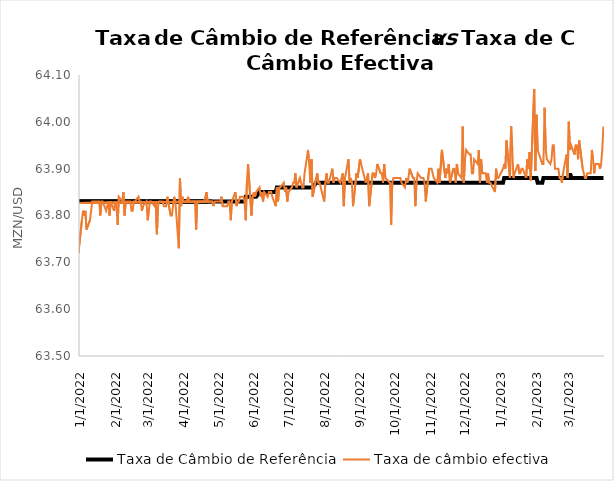
| Category | Taxa de Câmbio de Referência | Taxa de câmbio efectiva |
|---|---|---|
| 12/14/21 | 63.83 | 63.76 |
| 12/15/21 | 63.83 | 63.82 |
| 12/16/21 | 63.83 | 63.8 |
| 12/17/21 | 63.83 | 63.79 |
| 12/20/21 | 63.83 | 63.84 |
| 12/21/21 | 63.83 | 63.79 |
| 12/22/21 | 63.83 | 63.8 |
| 12/23/21 | 63.83 | 63.82 |
| 12/27/21 | 63.83 | 63.77 |
| 12/28/21 | 63.83 | 63.74 |
| 12/29/21 | 63.83 | 63.76 |
| 12/30/21 | 63.83 | 63.78 |
| 12/31/21 | 63.83 | 63.72 |
| 1/3/22 | 63.83 | 63.79 |
| 1/4/22 | 63.83 | 63.81 |
| 1/5/22 | 63.83 | 63.8 |
| 1/6/22 | 63.83 | 63.81 |
| 1/7/22 | 63.83 | 63.77 |
| 1/10/22 | 63.83 | 63.79 |
| 1/12/22 | 63.83 | 63.83 |
| 1/13/22 | 63.83 | 63.83 |
| 1/14/22 | 63.83 | 63.83 |
| 1/17/22 | 63.83 | 63.83 |
| 1/18/22 | 63.83 | 63.83 |
| 1/19/22 | 63.83 | 63.8 |
| 1/20/22 | 63.83 | 63.83 |
| 1/21/22 | 63.83 | 63.83 |
| 1/24/22 | 63.83 | 63.81 |
| 1/25/22 | 63.83 | 63.82 |
| 1/26/22 | 63.83 | 63.83 |
| 1/27/22 | 63.83 | 63.8 |
| 1/28/22 | 63.83 | 63.83 |
| 1/31/22 | 63.83 | 63.81 |
| 2/1/22 | 63.83 | 63.83 |
| 2/2/22 | 63.83 | 63.82 |
| 2/3/22 | 63.83 | 63.78 |
| 2/4/22 | 63.83 | 63.84 |
| 2/7/22 | 63.83 | 63.83 |
| 2/8/22 | 63.83 | 63.85 |
| 2/9/22 | 63.83 | 63.8 |
| 2/10/22 | 63.83 | 63.83 |
| 2/11/22 | 63.83 | 63.83 |
| 2/14/22 | 63.83 | 63.83 |
| 2/15/22 | 63.83 | 63.81 |
| 2/16/22 | 63.83 | 63.81 |
| 2/17/22 | 63.83 | 63.83 |
| 2/18/22 | 63.83 | 63.83 |
| 2/21/22 | 63.83 | 63.84 |
| 2/22/22 | 63.83 | 63.83 |
| 2/23/22 | 63.83 | 63.83 |
| 2/24/22 | 63.83 | 63.81 |
| 2/25/22 | 63.83 | 63.82 |
| 2/28/22 | 63.83 | 63.83 |
| 3/1/22 | 63.83 | 63.79 |
| 3/2/22 | 63.83 | 63.81 |
| 3/3/22 | 63.83 | 63.83 |
| 3/4/22 | 63.83 | 63.83 |
| 3/7/22 | 63.83 | 63.82 |
| 3/8/22 | 63.83 | 63.83 |
| 3/9/22 | 63.83 | 63.76 |
| 3/10/22 | 63.83 | 63.82 |
| 3/11/22 | 63.83 | 63.83 |
| 3/14/22 | 63.83 | 63.83 |
| 3/15/22 | 63.83 | 63.82 |
| 3/16/22 | 63.83 | 63.82 |
| 3/17/22 | 63.83 | 63.82 |
| 3/18/22 | 63.83 | 63.84 |
| 3/21/22 | 63.83 | 63.8 |
| 3/22/22 | 63.83 | 63.8 |
| 3/23/22 | 63.83 | 63.82 |
| 3/24/22 | 63.83 | 63.84 |
| 3/25/22 | 63.83 | 63.83 |
| 3/28/22 | 63.83 | 63.73 |
| 3/29/22 | 63.83 | 63.88 |
| 3/30/22 | 63.83 | 63.82 |
| 3/31/22 | 63.83 | 63.84 |
| 4/1/22 | 63.83 | 63.83 |
| 4/4/22 | 63.83 | 63.83 |
| 4/5/22 | 63.83 | 63.84 |
| 4/6/22 | 63.83 | 63.83 |
| 4/8/22 | 63.83 | 63.83 |
| 4/11/22 | 63.83 | 63.83 |
| 4/12/22 | 63.83 | 63.77 |
| 4/13/22 | 63.83 | 63.83 |
| 4/14/22 | 63.83 | 63.83 |
| 4/18/22 | 63.83 | 63.83 |
| 4/19/22 | 63.83 | 63.83 |
| 4/20/22 | 63.83 | 63.84 |
| 4/21/22 | 63.83 | 63.85 |
| 4/22/22 | 63.83 | 63.83 |
| 4/25/20 | 63.83 | 63.81 |
| 4/26/22 | 63.83 | 63.83 |
| 4/27/22 | 63.83 | 63.82 |
| 4/28/22 | 63.83 | 63.83 |
| 4/29/22 | 63.83 | 63.83 |
| 5/3/22 | 63.83 | 63.83 |
| 5/4/22 | 63.83 | 63.84 |
| 5/5/22 | 63.83 | 63.82 |
| 5/6/22 | 63.83 | 63.82 |
| 5/9/22 | 63.83 | 63.82 |
| 5/10/22 | 63.83 | 63.83 |
| 5/11/22 | 63.83 | 63.83 |
| 5/12/22 | 63.83 | 63.79 |
| 5/13/22 | 63.83 | 63.83 |
| 5/16/22 | 63.83 | 63.85 |
| 5/17/22 | 63.83 | 63.82 |
| 5/18/22 | 63.83 | 63.83 |
| 5/19/22 | 63.83 | 63.83 |
| 5/20/22 | 63.83 | 63.84 |
| 5/23/22 | 63.83 | 63.84 |
| 5/24/22 | 63.83 | 63.83 |
| 5/25/22 | 63.84 | 63.79 |
| 5/26/22 | 63.84 | 63.87 |
| 5/27/22 | 63.84 | 63.91 |
| 5/30/22 | 63.84 | 63.8 |
| 5/31/22 | 63.84 | 63.84 |
| 6/1/22 | 63.84 | 63.85 |
| 6/2/22 | 63.84 | 63.84 |
| 6/3/22 | 63.84 | 63.85 |
| 6/6/22 | 63.85 | 63.86 |
| 6/7/22 | 63.85 | 63.84 |
| 6/8/22 | 63.85 | 63.85 |
| 6/9/22 | 63.85 | 63.83 |
| 6/10/22 | 63.85 | 63.85 |
| 6/13/22 | 63.85 | 63.84 |
| 6/14/22 | 63.85 | 63.85 |
| 6/15/22 | 63.85 | 63.85 |
| 6/16/22 | 63.85 | 63.85 |
| 6/17/22 | 63.85 | 63.84 |
| 6/20/22 | 63.85 | 63.82 |
| 6/21/22 | 63.86 | 63.86 |
| 6/22/22 | 63.86 | 63.83 |
| 6/23/22 | 63.86 | 63.86 |
| 6/24/22 | 63.86 | 63.86 |
| 6/27/22 | 63.86 | 63.87 |
| 6/28/22 | 63.86 | 63.85 |
| 6/29/22 | 63.86 | 63.86 |
| 6/30/22 | 63.86 | 63.83 |
| 7/1/22 | 63.86 | 63.85 |
| 7/4/22 | 63.86 | 63.86 |
| 7/5/22 | 63.86 | 63.87 |
| 7/6/22 | 63.86 | 63.87 |
| 7/7/22 | 63.86 | 63.89 |
| 7/8/22 | 63.86 | 63.86 |
| 7/11/22 | 63.86 | 63.88 |
| 7/12/22 | 63.86 | 63.87 |
| 7/13/22 | 63.86 | 63.86 |
| 7/14/22 | 63.86 | 63.86 |
| 7/15/22 | 63.86 | 63.89 |
| 7/18/22 | 63.86 | 63.94 |
| 7/19/22 | 63.86 | 63.91 |
| 7/20/22 | 63.86 | 63.87 |
| 7/21/22 | 63.86 | 63.92 |
| 7/22/22 | 63.86 | 63.84 |
| 7/25/22 | 63.87 | 63.88 |
| 7/26/22 | 63.87 | 63.89 |
| 7/27/22 | 63.87 | 63.87 |
| 7/28/22 | 63.87 | 63.87 |
| 7/29/22 | 63.87 | 63.86 |
| 8/1/22 | 63.87 | 63.83 |
| 8/2/22 | 63.87 | 63.87 |
| 8/3/22 | 63.87 | 63.89 |
| 8/4/22 | 63.87 | 63.87 |
| 8/5/22 | 63.87 | 63.87 |
| 8/8/22 | 63.87 | 63.9 |
| 8/9/22 | 63.87 | 63.87 |
| 8/10/22 | 63.87 | 63.88 |
| 8/11/22 | 63.87 | 63.88 |
| 8/12/22 | 63.87 | 63.88 |
| 8/15/22 | 63.87 | 63.87 |
| 8/16/22 | 63.87 | 63.88 |
| 8/17/22 | 63.87 | 63.89 |
| 8/18/22 | 63.87 | 63.82 |
| 8/19/22 | 63.87 | 63.88 |
| 8/22/22 | 63.87 | 63.92 |
| 8/23/22 | 63.87 | 63.87 |
| 8/24/22 | 63.87 | 63.88 |
| 8/25/22 | 63.87 | 63.87 |
| 8/26/22 | 63.87 | 63.82 |
| 8/29/22 | 63.87 | 63.89 |
| 8/30/22 | 63.87 | 63.88 |
| 9/1/22 | 63.87 | 63.92 |
| 9/2/22 | 63.87 | 63.91 |
| 9/5/22 | 63.87 | 63.88 |
| 9/6/22 | 63.87 | 63.87 |
| 9/8/22 | 63.87 | 63.89 |
| 9/9/22 | 63.87 | 63.82 |
| 9/12/22 | 63.87 | 63.89 |
| 9/13/22 | 63.87 | 63.89 |
| 9/14/22 | 63.87 | 63.88 |
| 9/15/22 | 63.87 | 63.89 |
| 9/16/22 | 63.87 | 63.91 |
| 9/19/22 | 63.87 | 63.89 |
| 9/20/22 | 63.87 | 63.89 |
| 9/21/22 | 63.87 | 63.87 |
| 9/22/22 | 63.87 | 63.91 |
| 9/23/22 | 63.87 | 63.88 |
| 9/27/22 | 63.87 | 63.87 |
| 9/28/22 | 63.87 | 63.78 |
| 9/29/22 | 63.87 | 63.87 |
| 9/30/22 | 63.87 | 63.88 |
| 10/3/22 | 63.87 | 63.88 |
| 10/5/22 | 63.87 | 63.88 |
| 10/6/22 | 63.87 | 63.88 |
| 10/7/22 | 63.87 | 63.87 |
| 10/10/22 | 63.87 | 63.86 |
| 10/11/22 | 63.87 | 63.88 |
| 10/12/22 | 63.87 | 63.87 |
| 10/13/22 | 63.87 | 63.88 |
| 10/14/22 | 63.87 | 63.9 |
| 10/17/22 | 63.87 | 63.88 |
| 10/18/22 | 63.87 | 63.88 |
| 10/19/22 | 63.87 | 63.82 |
| 10/20/22 | 63.87 | 63.87 |
| 10/21/22 | 63.87 | 63.89 |
| 10/24/22 | 63.87 | 63.88 |
| 10/25/22 | 63.87 | 63.88 |
| 10/26/22 | 63.87 | 63.88 |
| 10/27/22 | 63.87 | 63.87 |
| 10/28/22 | 63.87 | 63.83 |
| 10/31/22 | 63.87 | 63.9 |
| 11/1/22 | 63.87 | 63.9 |
| 11/2/22 | 63.87 | 63.9 |
| 11/3/22 | 63.87 | 63.89 |
| 11/4/22 | 63.87 | 63.88 |
| 11/7/22 | 63.87 | 63.87 |
| 11/8/22 | 63.87 | 63.9 |
| 11/9/22 | 63.87 | 63.87 |
| 11/11/22 | 63.87 | 63.94 |
| 11/14/22 | 63.87 | 63.88 |
| 11/15/22 | 63.87 | 63.9 |
| 11/16/22 | 63.87 | 63.89 |
| 11/17/22 | 63.87 | 63.91 |
| 11/18/22 | 63.87 | 63.87 |
| 11/21/22 | 63.87 | 63.9 |
| 11/22/22 | 63.87 | 63.9 |
| 11/23/22 | 63.87 | 63.87 |
| 11/24/22 | 63.87 | 63.91 |
| 11/25/22 | 63.87 | 63.89 |
| 11/28/22 | 63.87 | 63.88 |
| 11/29/22 | 63.87 | 63.99 |
| 11/30/22 | 63.87 | 63.87 |
| 12/1/22 | 63.87 | 63.92 |
| 12/2/22 | 63.87 | 63.94 |
| 12/5/22 | 63.87 | 63.93 |
| 12/6/22 | 63.87 | 63.93 |
| 12/7/22 | 63.87 | 63.89 |
| 12/8/22 | 63.87 | 63.89 |
| 12/9/22 | 63.87 | 63.92 |
| 12/12/22 | 63.87 | 63.91 |
| 12/13/22 | 63.87 | 63.94 |
| 12/14/22 | 63.87 | 63.87 |
| 12/15/22 | 63.87 | 63.92 |
| 12/16/22 | 63.87 | 63.89 |
| 12/19/22 | 63.87 | 63.89 |
| 12/20/22 | 63.87 | 63.87 |
| 12/21/22 | 63.87 | 63.89 |
| 12/22/22 | 63.87 | 63.87 |
| 12/23/22 | 63.87 | 63.87 |
| 12/27/22 | 63.87 | 63.85 |
| 12/28/22 | 63.87 | 63.9 |
| 12/29/22 | 63.87 | 63.88 |
| 12/30/22 | 63.87 | 63.88 |
| 1/3/23 | 63.87 | 63.9 |
| 1/4/23 | 63.88 | 63.91 |
| 1/5/23 | 63.88 | 63.9 |
| 1/6/23 | 63.88 | 63.96 |
| 1/9/23 | 63.88 | 63.88 |
| 1/10/23 | 63.88 | 63.99 |
| 1/11/23 | 63.88 | 63.94 |
| 1/12/23 | 63.88 | 63.88 |
| 1/13/23 | 63.88 | 63.89 |
| 1/16/23 | 63.88 | 63.91 |
| 1/17/23 | 63.88 | 63.89 |
| 1/18/23 | 63.88 | 63.89 |
| 1/19/23 | 63.88 | 63.9 |
| 1/20/23 | 63.88 | 63.9 |
| 1/23/23 | 63.88 | 63.88 |
| 1/24/23 | 63.88 | 63.92 |
| 1/25/23 | 63.88 | 63.9 |
| 1/26/23 | 63.88 | 63.935 |
| 1/27/23 | 63.88 | 63.875 |
| 1/30/23 | 63.88 | 64.07 |
| 1/31/23 | 63.88 | 63.895 |
| 2/1/23 | 63.88 | 64.015 |
| 2/2/23 | 63.87 | 63.94 |
| 2/6/23 | 63.87 | 63.91 |
| 2/7/23 | 63.88 | 63.91 |
| 2/8/23 | 63.88 | 64.03 |
| 2/9/23 | 63.88 | 63.94 |
| 2/10/23 | 63.88 | 63.92 |
| 2/13/23 | 63.88 | 63.91 |
| 2/14/23 | 63.88 | 63.92 |
| 2/15/23 | 63.88 | 63.95 |
| 2/16/23 | 63.88 | 63.95 |
| 2/17/23 | 63.88 | 63.9 |
| 2/20/23 | 63.88 | 63.9 |
| 2/21/23 | 63.88 | 63.88 |
| 2/22/23 | 63.88 | 63.88 |
| 2/23/23 | 63.88 | 63.87 |
| 2/24/23 | 63.88 | 63.89 |
| 2/27/23 | 63.88 | 63.93 |
| 2/28/23 | 63.88 | 63.88 |
| 3/1/23 | 63.88 | 64 |
| 3/2/23 | 63.89 | 63.94 |
| 3/3/23 | 63.88 | 63.95 |
| 3/6/23 | 63.88 | 63.93 |
| 3/7/23 | 63.88 | 63.95 |
| 3/8/23 | 63.88 | 63.95 |
| 3/9/23 | 63.88 | 63.92 |
| 3/10/23 | 63.88 | 63.96 |
| 3/13/23 | 63.88 | 63.9 |
| 3/14/23 | 63.88 | 63.89 |
| 3/15/23 | 63.88 | 63.88 |
| 3/16/23 | 63.88 | 63.88 |
| 3/17/23 | 63.88 | 63.89 |
| 3/20/23 | 63.88 | 63.89 |
| 3/21/23 | 63.88 | 63.94 |
| 3/22/23 | 63.88 | 63.92 |
| 3/23/23 | 63.88 | 63.89 |
| 3/24/23 | 63.88 | 63.91 |
| 3/27/23 | 63.88 | 63.91 |
| 3/28/23 | 63.88 | 63.9 |
| 3/29/23 | 63.88 | 63.91 |
| 3/30/23 | 63.88 | 63.94 |
| 3/31/23 | 63.88 | 63.99 |